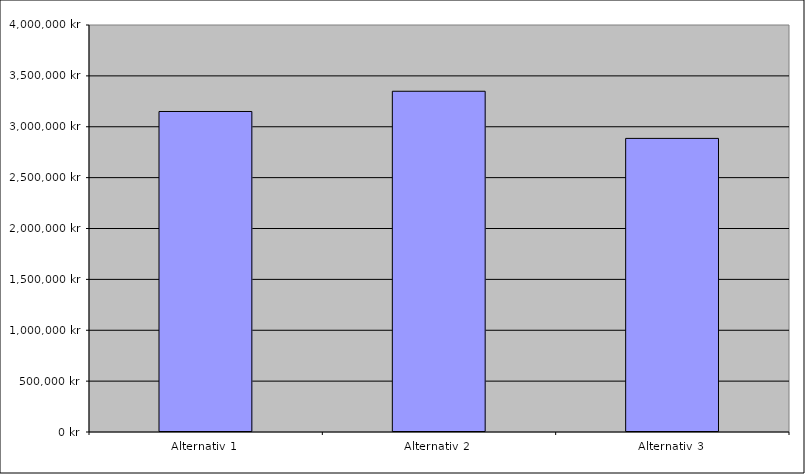
| Category | Series 0 |
|---|---|
| Alternativ 1 | 3149959.012 |
| Alternativ 2 | 3348891.636 |
| Alternativ 3 | 2885488.959 |